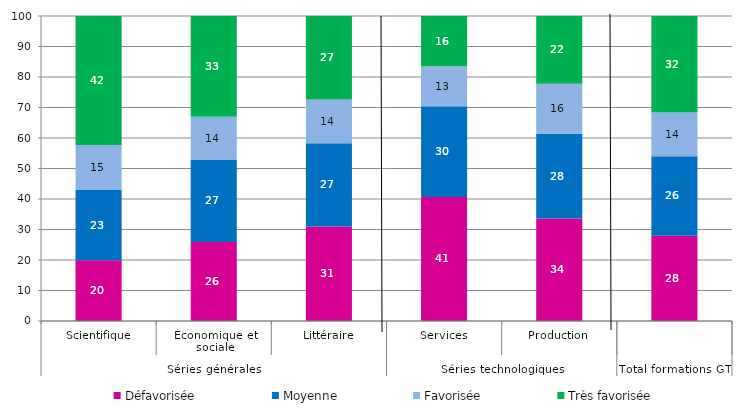
| Category | Défavorisée | Moyenne | Favorisée | Très favorisée |
|---|---|---|---|---|
| 0 | 19.93 | 23.02 | 14.76 | 42.29 |
| 1 | 25.94 | 26.97 | 14.08 | 33.01 |
| 2 | 30.95 | 27.29 | 14.37 | 27.39 |
| 3 | 40.66 | 29.72 | 13.14 | 16.47 |
| 4 | 33.62 | 27.78 | 16.37 | 22.23 |
| 5 | 27.97 | 26.08 | 14.28 | 31.66 |